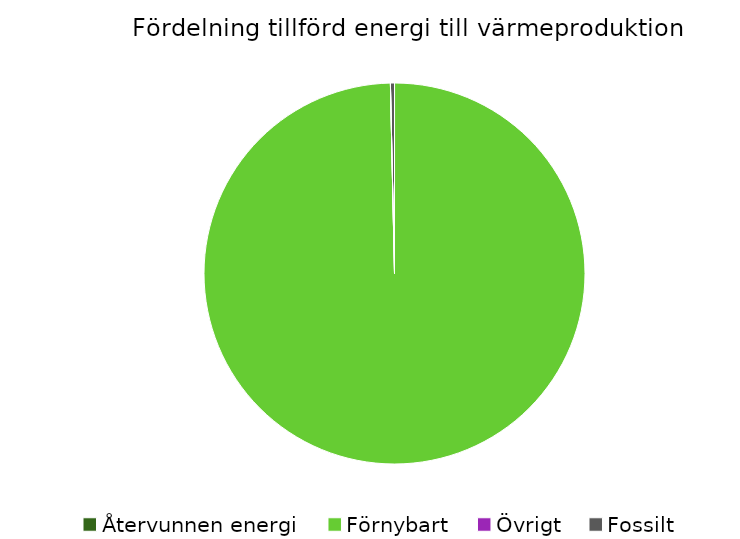
| Category | Fördelning värmeproduktion |
|---|---|
| Återvunnen energi | 0 |
| Förnybart | 0.997 |
| Övrigt | 0 |
| Fossilt | 0.003 |